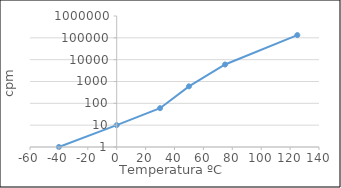
| Category | Series 0 |
|---|---|
| -40.0 | 1 |
| 0.0 | 10 |
| 30.0 | 60 |
| 50.0 | 600 |
| 75.0 | 6000 |
| 125.0 | 133333.333 |